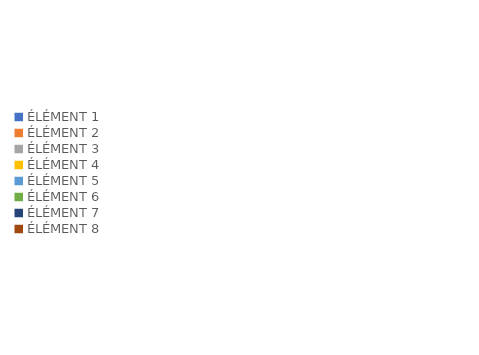
| Category | Series 0 | Series 1 |
|---|---|---|
| ÉLÉMENT 1 | 0 | 0 |
| ÉLÉMENT 2 | 0 | 0 |
| ÉLÉMENT 3 | 0 | 0 |
| ÉLÉMENT 4 | 0 | 0 |
| ÉLÉMENT 5 | 0 | 0 |
| ÉLÉMENT 6 | 0 | 0 |
| ÉLÉMENT 7 | 0 | 0 |
| ÉLÉMENT 8 | 0 | 0 |